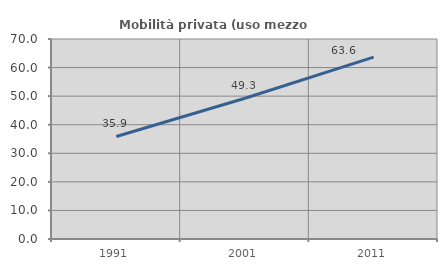
| Category | Mobilità privata (uso mezzo privato) |
|---|---|
| 1991.0 | 35.886 |
| 2001.0 | 49.254 |
| 2011.0 | 63.636 |